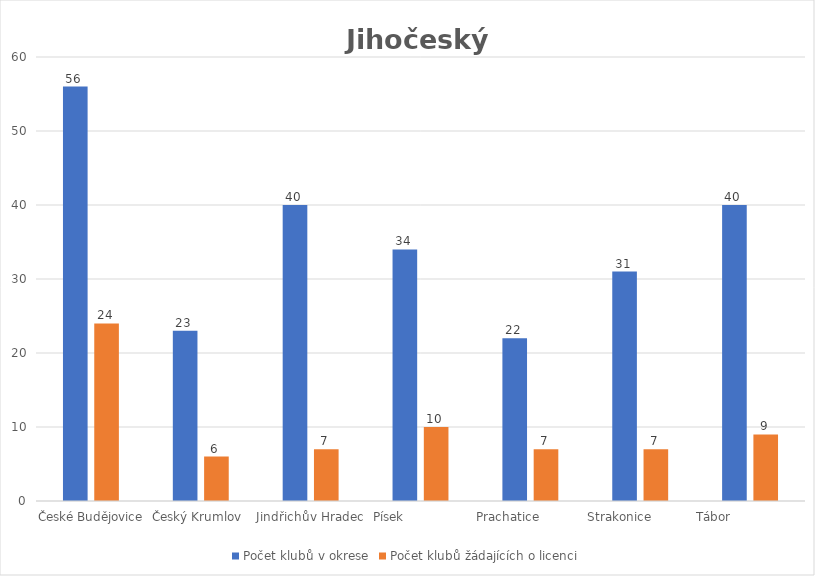
| Category | Počet klubů v okrese | Počet klubů žádajících o licenci |
|---|---|---|
| České Budějovice | 56 | 24 |
| Český Krumlov  | 23 | 6 |
| Jindřichův Hradec | 40 | 7 |
| Písek                 | 34 | 10 |
| Prachatice             | 22 | 7 |
| Strakonice           | 31 | 7 |
| Tábor                    | 40 | 9 |